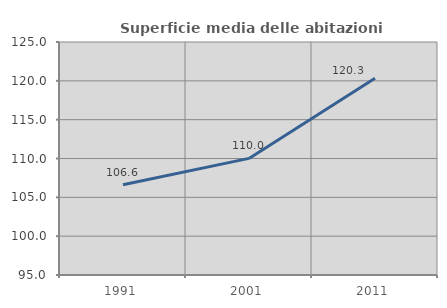
| Category | Superficie media delle abitazioni occupate |
|---|---|
| 1991.0 | 106.621 |
| 2001.0 | 110.013 |
| 2011.0 | 120.32 |